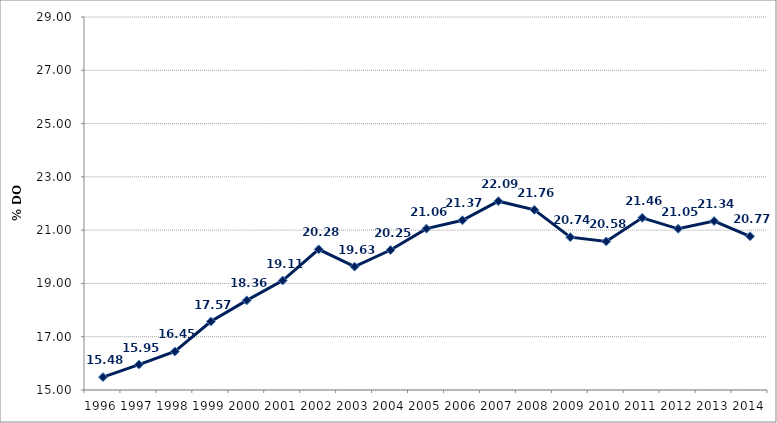
| Category | Series 0 |
|---|---|
| 1996 | 15.484 |
| 1997 | 15.955 |
| 1998 | 16.446 |
| 1999 | 17.57 |
| 2000 | 18.365 |
| 2001 | 19.109 |
| 2002 | 20.279 |
| 2003 | 19.63 |
| 2004 | 20.254 |
| 2005 | 21.057 |
| 2006 | 21.37 |
| 2007 | 22.087 |
| 2008 | 21.762 |
| 2009 | 20.736 |
| 2010 | 20.576 |
| 2011 | 21.462 |
| 2012 | 21.05 |
| 2013 | 21.341 |
| 2014 | 20.77 |